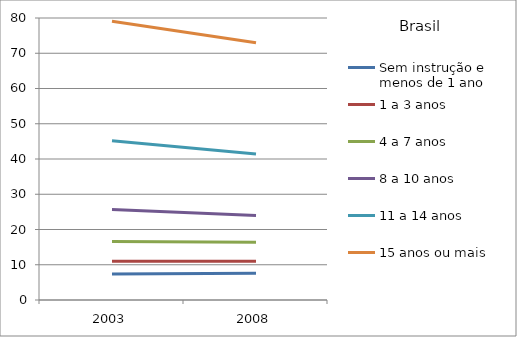
| Category | Sem instrução e menos de 1 ano | 1 a 3 anos | 4 a 7 anos | 8 a 10 anos | 11 a 14 anos | 15 anos ou mais |
|---|---|---|---|---|---|---|
| 2003.0 | 7.4 | 11 | 16.6 | 25.7 | 45.2 | 79.1 |
| 2008.0 | 7.6 | 11 | 16.4 | 24 | 41.4 | 73 |